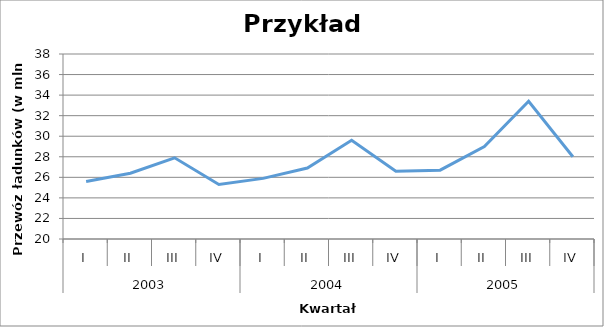
| Category | Series 0 |
|---|---|
| 0 | 25.6 |
| 1 | 26.4 |
| 2 | 27.9 |
| 3 | 25.3 |
| 4 | 25.9 |
| 5 | 26.9 |
| 6 | 29.6 |
| 7 | 26.6 |
| 8 | 26.7 |
| 9 | 29 |
| 10 | 33.4 |
| 11 | 28 |